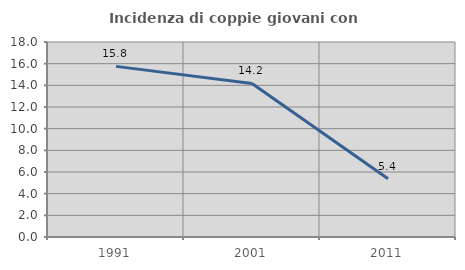
| Category | Incidenza di coppie giovani con figli |
|---|---|
| 1991.0 | 15.751 |
| 2001.0 | 14.176 |
| 2011.0 | 5.381 |